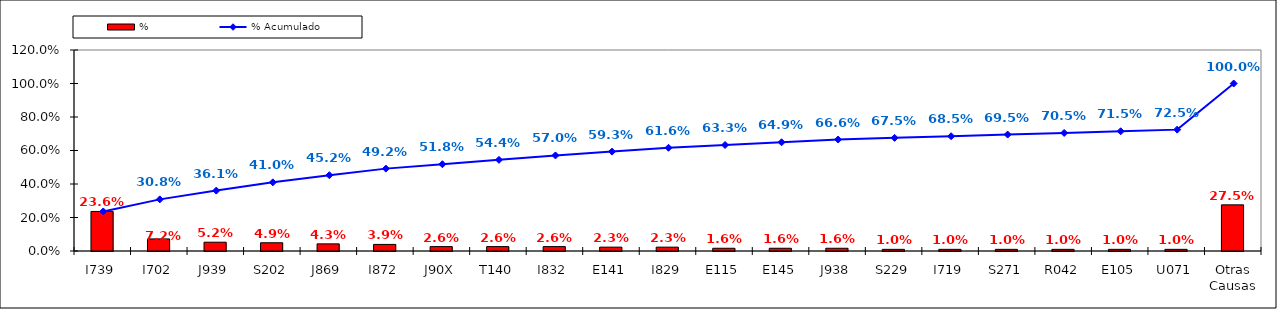
| Category | % |
|---|---|
| I739 | 0.236 |
| I702 | 0.072 |
| J939 | 0.052 |
| S202 | 0.049 |
| J869 | 0.043 |
| I872 | 0.039 |
| J90X | 0.026 |
| T140 | 0.026 |
| I832 | 0.026 |
| E141 | 0.023 |
| I829 | 0.023 |
| E115 | 0.016 |
| E145 | 0.016 |
| J938 | 0.016 |
| S229 | 0.01 |
| I719 | 0.01 |
| S271 | 0.01 |
| R042 | 0.01 |
| E105 | 0.01 |
| U071 | 0.01 |
| Otras Causas | 0.275 |